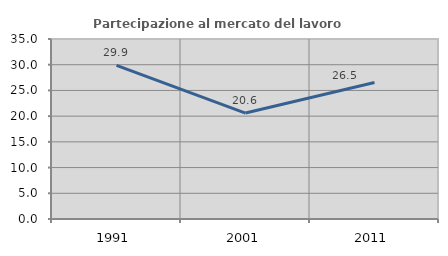
| Category | Partecipazione al mercato del lavoro  femminile |
|---|---|
| 1991.0 | 29.864 |
| 2001.0 | 20.599 |
| 2011.0 | 26.531 |